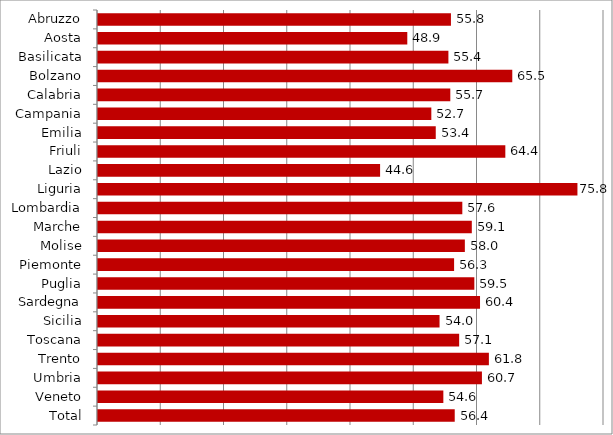
| Category | Regioni |
|---|---|
| Abruzzo | 55.8 |
| Aosta | 48.9 |
| Basilicata | 55.4 |
| Bolzano | 65.5 |
| Calabria | 55.7 |
| Campania | 52.7 |
| Emilia | 53.4 |
| Friuli | 64.4 |
| Lazio | 44.6 |
| Liguria | 75.8 |
| Lombardia | 57.6 |
| Marche | 59.1 |
| Molise | 58 |
| Piemonte | 56.3 |
| Puglia | 59.5 |
| Sardegna | 60.4 |
| Sicilia | 54 |
| Toscana | 57.1 |
| Trento | 61.8 |
| Umbria | 60.7 |
| Veneto | 54.6 |
| Total | 56.4 |